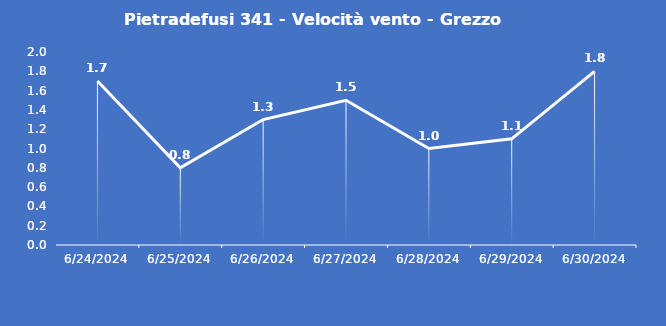
| Category | Pietradefusi 341 - Velocità vento - Grezzo (m/s) |
|---|---|
| 6/24/24 | 1.7 |
| 6/25/24 | 0.8 |
| 6/26/24 | 1.3 |
| 6/27/24 | 1.5 |
| 6/28/24 | 1 |
| 6/29/24 | 1.1 |
| 6/30/24 | 1.8 |